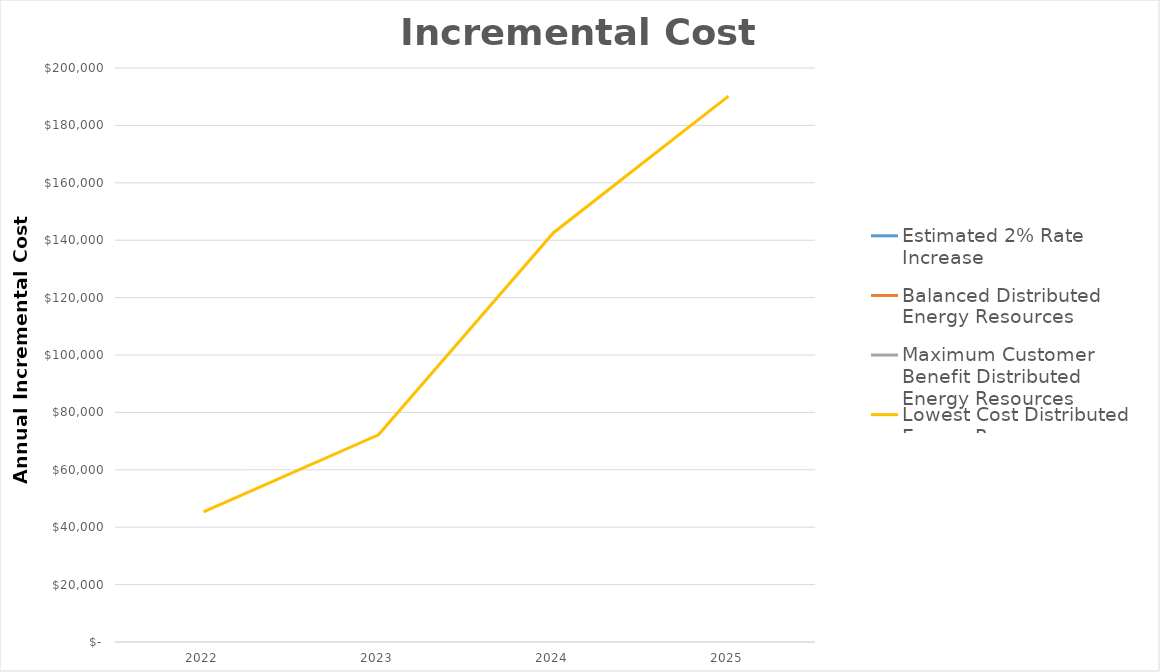
| Category | Estimated 2% Rate Increase | Balanced Distributed Energy Resources | Maximum Customer Benefit Distributed Energy Resources | Lowest Cost Distributed Energy Resources |
|---|---|---|---|---|
| 2022.0 |  |  |  | 45316.501 |
| 2023.0 |  |  |  | 72181.752 |
| 2024.0 |  |  |  | 142610.947 |
| 2025.0 |  |  |  | 190198.16 |